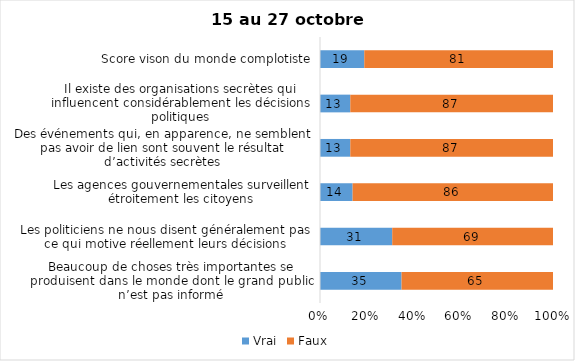
| Category | Vrai | Faux |
|---|---|---|
| Beaucoup de choses très importantes se produisent dans le monde dont le grand public n’est pas informé | 35 | 65 |
| Les politiciens ne nous disent généralement pas ce qui motive réellement leurs décisions | 31 | 69 |
| Les agences gouvernementales surveillent étroitement les citoyens | 14 | 86 |
| Des événements qui, en apparence, ne semblent pas avoir de lien sont souvent le résultat d’activités secrètes | 13 | 87 |
| Il existe des organisations secrètes qui influencent considérablement les décisions politiques | 13 | 87 |
| Score vison du monde complotiste | 19 | 81 |